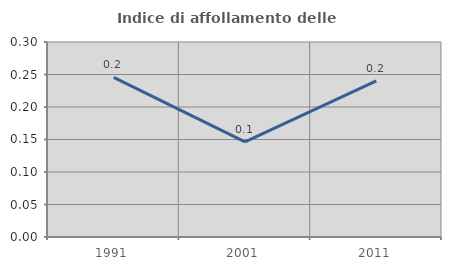
| Category | Indice di affollamento delle abitazioni  |
|---|---|
| 1991.0 | 0.246 |
| 2001.0 | 0.146 |
| 2011.0 | 0.24 |